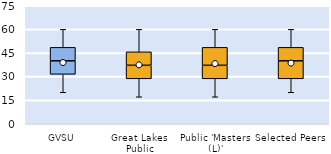
| Category | 25th | 50th | 75th |
|---|---|---|---|
| GVSU | 31.429 | 8.571 | 8.571 |
| Great Lakes Public | 28.571 | 8.571 | 8.571 |
| Public 'Masters (L)' | 28.571 | 8.571 | 11.429 |
| Selected Peers | 28.571 | 11.429 | 8.571 |